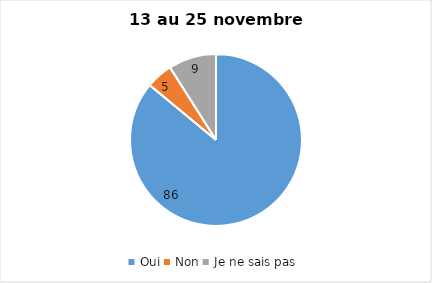
| Category | Series 0 |
|---|---|
| Oui | 86 |
| Non | 5 |
| Je ne sais pas | 9 |